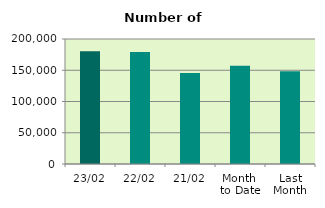
| Category | Series 0 |
|---|---|
| 23/02 | 180566 |
| 22/02 | 179248 |
| 21/02 | 145690 |
| Month 
to Date | 157345.647 |
| Last
Month | 148479.905 |